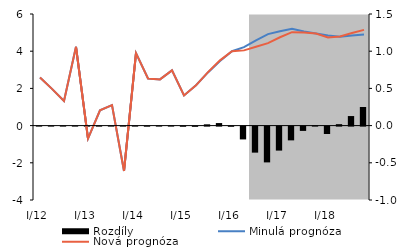
| Category | Rozdíly |
|---|---|
| I/12 | 0 |
| II | 0 |
| III | 0 |
| IV | 0 |
| I/13 | 0 |
| II | -0.001 |
| III | 0 |
| IV | 0.001 |
| I/14 | 0 |
| II | -0.001 |
| III | 0.001 |
| IV | 0.002 |
| I/15 | -0.002 |
| II | -0.003 |
| III | 0.017 |
| IV | 0.034 |
| I/16 | -0.003 |
| II | -0.172 |
| III | -0.35 |
| IV | -0.481 |
| I/17 | -0.323 |
| II | -0.185 |
| III | -0.058 |
| IV | 0.005 |
| I/18 | -0.099 |
| II | 0.019 |
| III | 0.128 |
| IV | 0.25 |